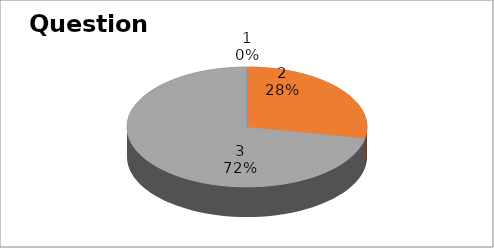
| Category | Series 0 |
|---|---|
| 0 | 0 |
| 1 | 7 |
| 2 | 18 |